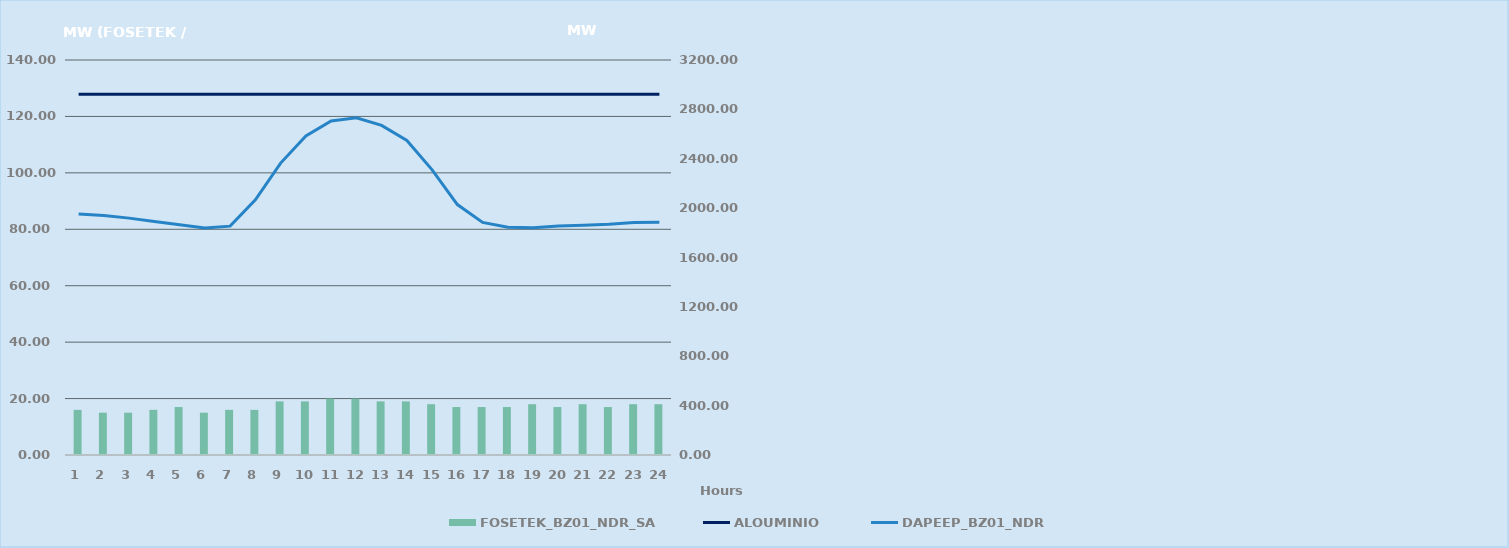
| Category | FOSETEK_BZ01_NDR_SA |
|---|---|
| 0 | 16 |
| 1 | 15 |
| 2 | 15 |
| 3 | 16 |
| 4 | 17 |
| 5 | 15 |
| 6 | 16 |
| 7 | 16 |
| 8 | 19 |
| 9 | 19 |
| 10 | 20 |
| 11 | 20 |
| 12 | 19 |
| 13 | 19 |
| 14 | 18 |
| 15 | 17 |
| 16 | 17 |
| 17 | 17 |
| 18 | 18 |
| 19 | 17 |
| 20 | 18 |
| 21 | 17 |
| 22 | 18 |
| 23 | 18 |